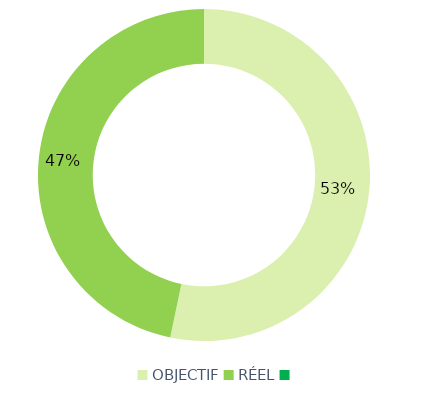
| Category | Series 0 |
|---|---|
| OBJECTIF | 245 |
| RÉEL | 215 |